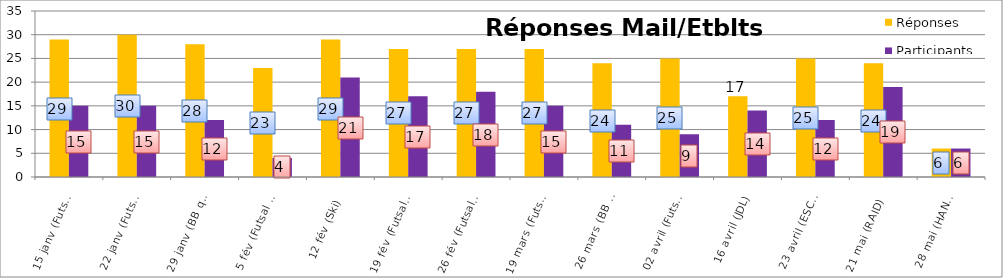
| Category | Réponses | Participants |
|---|---|---|
| 15 janv (Futsal Cdts + VB) | 29 | 15 |
| 22 janv (Futsal J/S + Bad + Escalade + Arbitrage BB) | 30 | 15 |
| 29 janv (BB qualif) | 28 | 12 |
| 5 fév (Futsal Filles + Championnats Dépt) | 23 | 4 |
| 12 fév (Ski) | 29 | 21 |
| 19 fév (Futsal Cadets 1/2 finales + Choré Collective) | 27 | 17 |
| 26 fév (Futsal J/S 1/2 finales + BB Finale LP) | 27 | 18 |
| 19 mars (Futsal filles + Cadets Finale LP + Bad de ptps) | 27 | 15 |
| 26 mars (BB 3/3 + Choré Coll + Finales Dpt Cadets) | 24 | 11 |
| 02 avril (Futsal Finale District J/S + VB) | 25 | 9 |
| 16 avril (JDL) | 17 | 14 |
| 23 avril (ESCALADE + Foot à 7) | 25 | 12 |
| 21 mai (RAID) | 24 | 19 |
| 28 mai (HANDISPORT) | 6 | 6 |